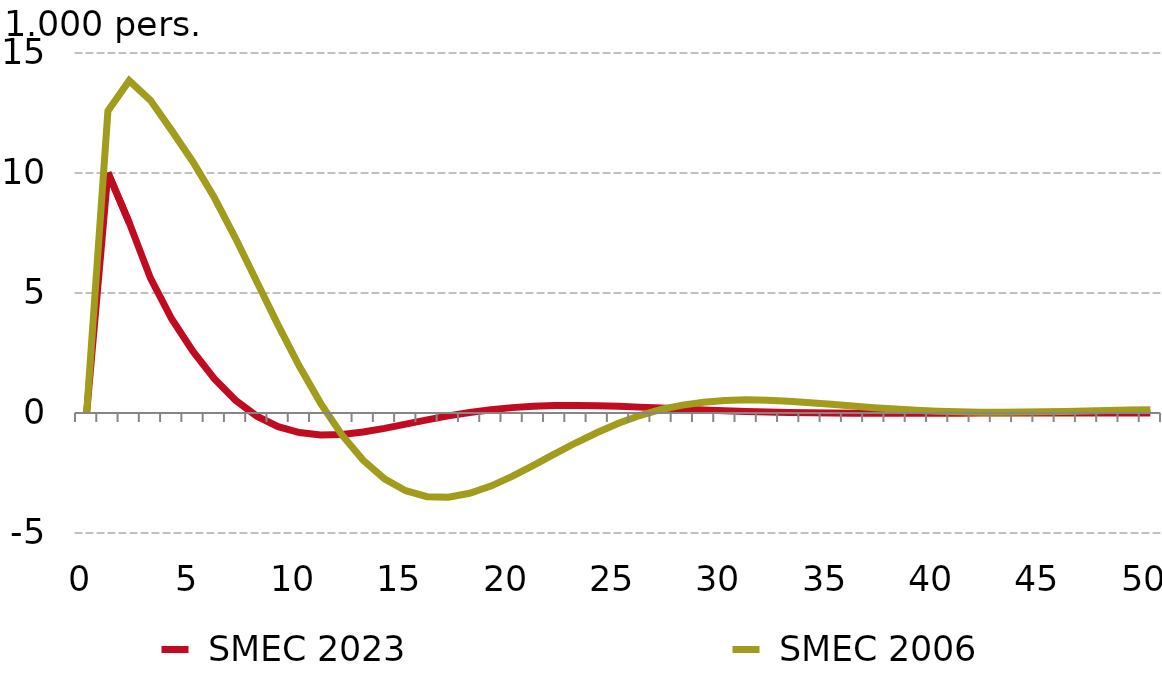
| Category |  SMEC 2023 |  SMEC 2006 |
|---|---|---|
| 0.0 | 0 | 0 |
| nan | 10.019 | 12.588 |
| nan | 7.935 | 13.848 |
| nan | 5.619 | 13.027 |
| nan | 3.916 | 11.766 |
| 5.0 | 2.569 | 10.462 |
| nan | 1.434 | 8.976 |
| nan | 0.529 | 7.28 |
| nan | -0.132 | 5.471 |
| nan | -0.57 | 3.661 |
| 10.0 | -0.817 | 1.946 |
| nan | -0.912 | 0.402 |
| nan | -0.891 | -0.915 |
| nan | -0.79 | -1.972 |
| nan | -0.639 | -2.74 |
| 15.0 | -0.464 | -3.239 |
| nan | -0.286 | -3.489 |
| nan | -0.12 | -3.507 |
| nan | 0.024 | -3.345 |
| nan | 0.139 | -3.046 |
| 20.0 | 0.224 | -2.639 |
| nan | 0.28 | -2.178 |
| nan | 0.309 | -1.703 |
| nan | 0.315 | -1.24 |
| nan | 0.303 | -0.812 |
| 25.0 | 0.278 | -0.426 |
| nan | 0.245 | -0.105 |
| nan | 0.207 | 0.146 |
| nan | 0.168 | 0.329 |
| nan | 0.13 | 0.448 |
| 30.0 | 0.096 | 0.521 |
| nan | 0.066 | 0.547 |
| nan | 0.041 | 0.532 |
| nan | 0.022 | 0.49 |
| nan | 0.008 | 0.431 |
| 35.0 | -0.002 | 0.361 |
| nan | -0.008 | 0.289 |
| nan | -0.011 | 0.221 |
| nan | -0.012 | 0.162 |
| nan | -0.011 | 0.112 |
| 40.0 | -0.009 | 0.074 |
| nan | -0.007 | 0.05 |
| nan | -0.004 | 0.036 |
| nan | -0.002 | 0.032 |
| nan | 0 | 0.038 |
| 45.0 | 0.002 | 0.05 |
| nan | 0.003 | 0.066 |
| nan | 0.003 | 0.085 |
| nan | 0.004 | 0.104 |
| nan | 0.004 | 0.124 |
| 50.0 | 0.003 | 0.14 |